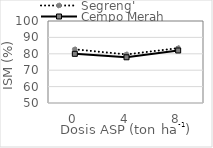
| Category | Segreng' | Cempo Merah |
|---|---|---|
| 0.0 | 82.72 | 79.98 |
| 4.0 | 79.63 | 77.87 |
| 8.0 | 83.45 | 82.02 |